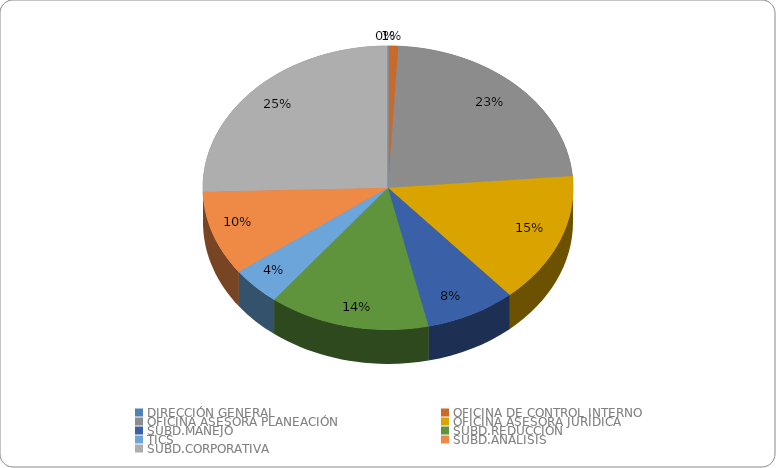
| Category | HALLAZGOS TOTALES |
|---|---|
| DIRECCIÓN GENERAL | 0 |
| OFICINA DE CONTROL INTERNO | 1 |
| OFICINA ASESORA PLANEACIÓN | 26 |
| OFICINA ASESORA JURÍDICA | 17 |
| SUBD.MANEJO | 9 |
| SUBD.REDUCCIÓN | 16 |
| TICS | 5 |
| SUBD.ANÁLISIS | 11 |
| SUBD.CORPORATIVA | 29 |